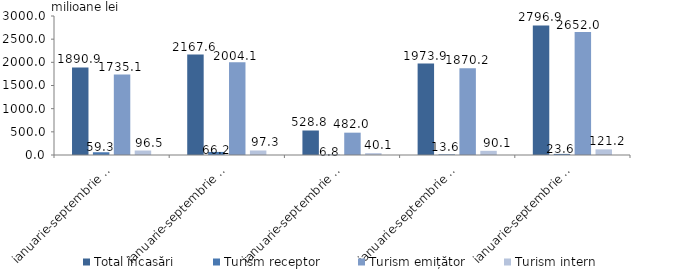
| Category | Total încasări | Turism receptor | Turism emițător | Turism intern |
|---|---|---|---|---|
| ianuarie-septembrie 2018 | 1890.9 | 59.3 | 1735.1 | 96.5 |
| ianuarie-septembrie 2019 | 2167.6 | 66.2 | 2004.1 | 97.3 |
| ianuarie-septembrie 2020 | 528.8 | 6.8 | 482 | 40.1 |
| ianuarie-septembrie 2021 | 1973.9 | 13.6 | 1870.2 | 90.1 |
| ianuarie-septembrie 2022 | 2796.9 | 23.6 | 2652 | 121.2 |